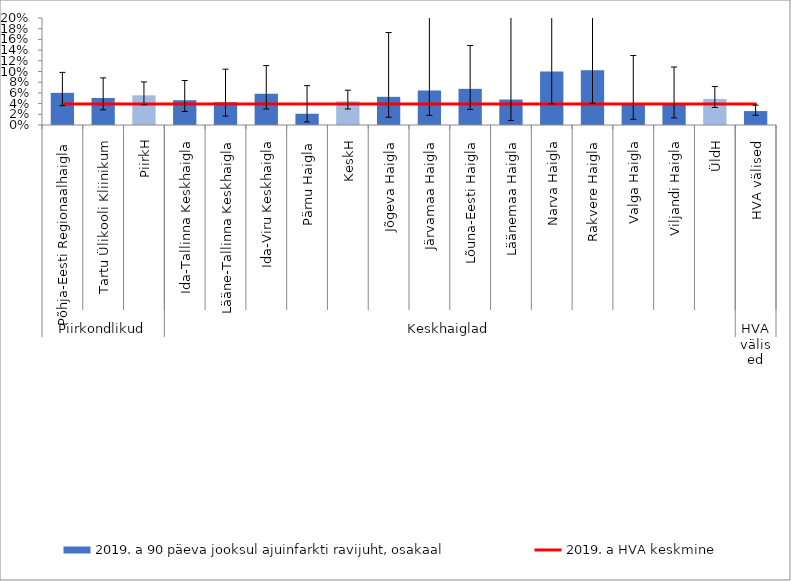
| Category | 2019. a 90 päeva jooksul ajuinfarkti ravijuht, osakaal |
|---|---|
| 0 | 0.06 |
| 1 | 0.05 |
| 2 | 0.055 |
| 3 | 0.046 |
| 4 | 0.043 |
| 5 | 0.058 |
| 6 | 0.021 |
| 7 | 0.044 |
| 8 | 0.053 |
| 9 | 0.065 |
| 10 | 0.068 |
| 11 | 0.048 |
| 12 | 0.1 |
| 13 | 0.103 |
| 14 | 0.038 |
| 15 | 0.039 |
| 16 | 0.049 |
| 17 | 0.026 |